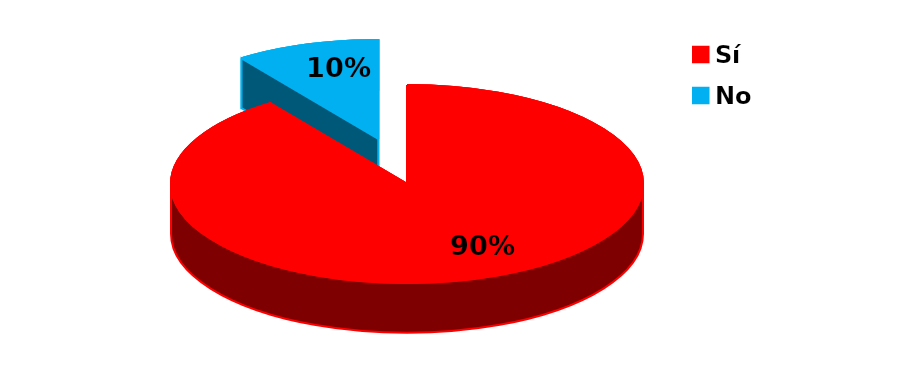
| Category | Series 0 |
|---|---|
| Sí | 110 |
| No | 12 |